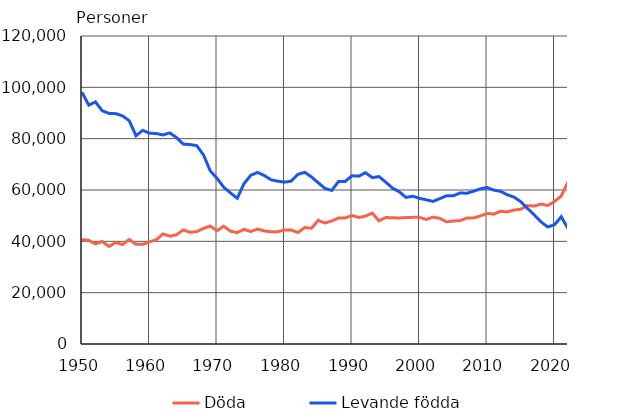
| Category | Döda | Levande födda |
|---|---|---|
| 1950 | 40681 | 98065 |
| 1951 | 40386 | 93063 |
| 1952 | 39024 | 94314 |
| 1953 | 39925 | 90866 |
| 1954 | 37988 | 89845 |
| 1955 | 39573 | 89740 |
| 1956 | 38713 | 88896 |
| 1957 | 40741 | 86985 |
| 1958 | 38833 | 81148 |
| 1959 | 38827 | 83253 |
| 1960 | 39797 | 82129 |
| 1961 | 40616 | 81996 |
| 1962 | 42889 | 81454 |
| 1963 | 42010 | 82251 |
| 1964 | 42512 | 80428 |
| 1965 | 44473 | 77885 |
| 1966 | 43548 | 77697 |
| 1967 | 43790 | 77289 |
| 1968 | 45013 | 73654 |
| 1969 | 45966 | 67450 |
| 1970 | 44119 | 64559 |
| 1971 | 45876 | 61067 |
| 1972 | 43958 | 58864 |
| 1973 | 43410 | 56787 |
| 1974 | 44676 | 62472 |
| 1975 | 43828 | 65719 |
| 1976 | 44786 | 66846 |
| 1977 | 44065 | 65659 |
| 1978 | 43692 | 63983 |
| 1979 | 43738 | 63428 |
| 1980 | 44398 | 63064 |
| 1981 | 44404 | 63469 |
| 1982 | 43408 | 66106 |
| 1983 | 45388 | 66892 |
| 1984 | 45098 | 65076 |
| 1985 | 48198 | 62796 |
| 1986 | 47135 | 60632 |
| 1987 | 47949 | 59827 |
| 1988 | 49063 | 63316 |
| 1989 | 49110 | 63348 |
| 1990 | 50058 | 65549 |
| 1991 | 49294 | 65395 |
| 1992 | 49844 | 66731 |
| 1993 | 50988 | 64826 |
| 1994 | 48000 | 65231 |
| 1995 | 49280 | 63067 |
| 1996 | 49167 | 60723 |
| 1997 | 49108 | 59329 |
| 1998 | 49262 | 57108 |
| 1999 | 49345 | 57574 |
| 2000 | 49339 | 56742 |
| 2001 | 48550 | 56189 |
| 2002 | 49418 | 55555 |
| 2003 | 48996 | 56630 |
| 2004 | 47600 | 57758 |
| 2005 | 47928 | 57745 |
| 2006 | 48065 | 58840 |
| 2007 | 49077 | 58729 |
| 2008 | 49094 | 59530 |
| 2009 | 49883 | 60430 |
| 2010 | 50887 | 60980 |
| 2011 | 50585 | 59961 |
| 2012 | 51707 | 59493 |
| 2013 | 51472 | 58134 |
| 2014 | 52186 | 57232 |
| 2015 | 52492 | 55472 |
| 2016 | 53923 | 52814 |
| 2017 | 53722 | 50321 |
| 2018 | 54527 | 47577 |
| 2019 | 53949 | 45613 |
| 2020 | 55488 | 46463 |
| 2021 | 57659 | 49594 |
| 2022 | 63219 | 44951 |